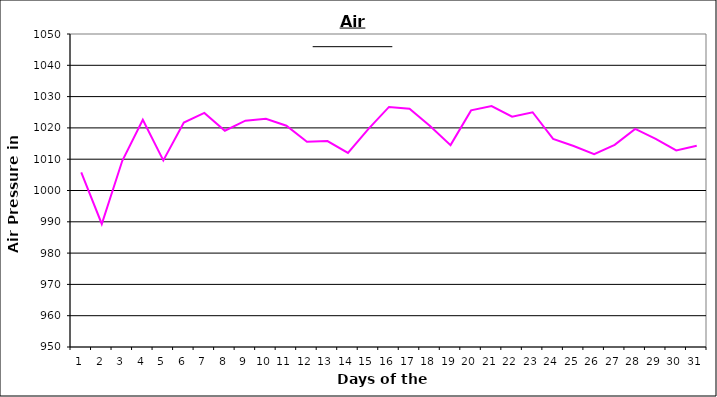
| Category | Series 0 |
|---|---|
| 0 | 1005.8 |
| 1 | 989.3 |
| 2 | 1009.5 |
| 3 | 1022.6 |
| 4 | 1009.6 |
| 5 | 1021.7 |
| 6 | 1024.8 |
| 7 | 1019.1 |
| 8 | 1022.3 |
| 9 | 1022.9 |
| 10 | 1020.7 |
| 11 | 1015.6 |
| 12 | 1015.8 |
| 13 | 1012 |
| 14 | 1019.7 |
| 15 | 1026.7 |
| 16 | 1026.1 |
| 17 | 1020.6 |
| 18 | 1014.5 |
| 19 | 1025.6 |
| 20 | 1027 |
| 21 | 1023.6 |
| 22 | 1025 |
| 23 | 1016.5 |
| 24 | 1014.2 |
| 25 | 1011.6 |
| 26 | 1014.6 |
| 27 | 1019.7 |
| 28 | 1016.5 |
| 29 | 1012.8 |
| 30 | 1014.3 |